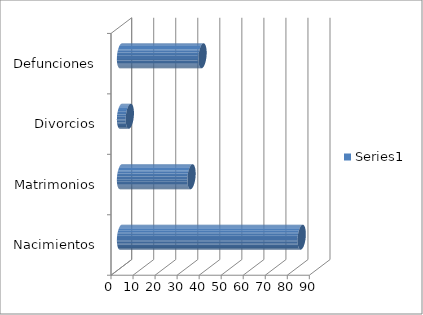
| Category | Series 0 |
|---|---|
| Nacimientos | 82 |
| Matrimonios | 32 |
| Divorcios | 4 |
| Defunciones | 37 |